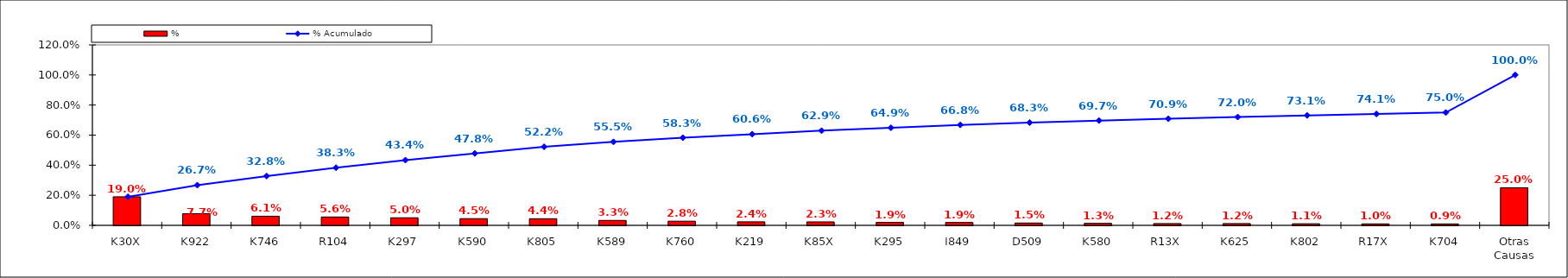
| Category | % |
|---|---|
| K30X | 0.19 |
| K922 | 0.077 |
| K746 | 0.061 |
| R104 | 0.056 |
| K297 | 0.05 |
| K590 | 0.045 |
| K805 | 0.044 |
| K589 | 0.033 |
| K760 | 0.028 |
| K219 | 0.024 |
| K85X | 0.023 |
| K295 | 0.019 |
| I849 | 0.019 |
| D509 | 0.015 |
| K580 | 0.013 |
| R13X | 0.012 |
| K625 | 0.012 |
| K802 | 0.011 |
| R17X | 0.01 |
| K704 | 0.009 |
| Otras Causas | 0.25 |